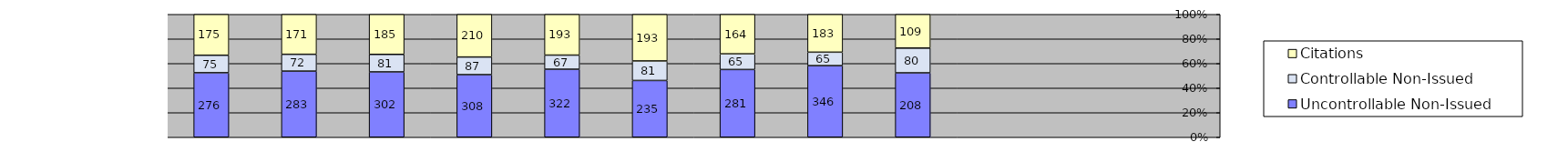
| Category | Uncontrollable Non-Issued | Controllable Non-Issued | Citations |
|---|---|---|---|
| 0 | 276 | 75 | 175 |
| 1900-01-01 | 283 | 72 | 171 |
| 1900-01-02 | 302 | 81 | 185 |
| 1900-01-03 | 308 | 87 | 210 |
| 1900-01-04 | 322 | 67 | 193 |
| 1900-01-05 | 235 | 81 | 193 |
| 1900-01-06 | 281 | 65 | 164 |
| 1900-01-07 | 346 | 65 | 183 |
| 1900-01-08 | 208 | 80 | 109 |
| 1900-01-09 | 0 | 0 | 0 |
| 1900-01-10 | 0 | 0 | 0 |
| 1900-01-11 | 0 | 0 | 0 |